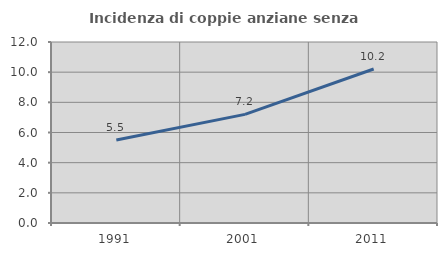
| Category | Incidenza di coppie anziane senza figli  |
|---|---|
| 1991.0 | 5.5 |
| 2001.0 | 7.203 |
| 2011.0 | 10.211 |